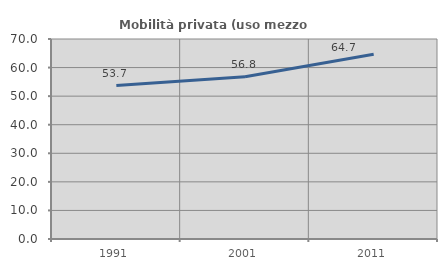
| Category | Mobilità privata (uso mezzo privato) |
|---|---|
| 1991.0 | 53.71 |
| 2001.0 | 56.757 |
| 2011.0 | 64.672 |